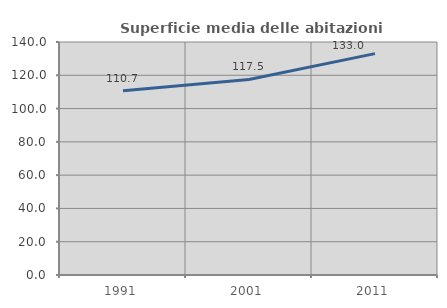
| Category | Superficie media delle abitazioni occupate |
|---|---|
| 1991.0 | 110.659 |
| 2001.0 | 117.522 |
| 2011.0 | 133.03 |